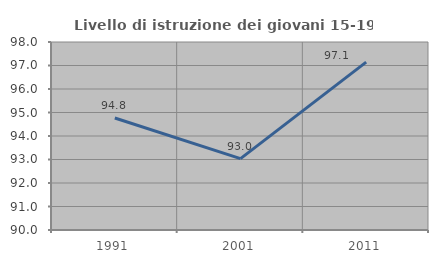
| Category | Livello di istruzione dei giovani 15-19 anni |
|---|---|
| 1991.0 | 94.764 |
| 2001.0 | 93.038 |
| 2011.0 | 97.143 |